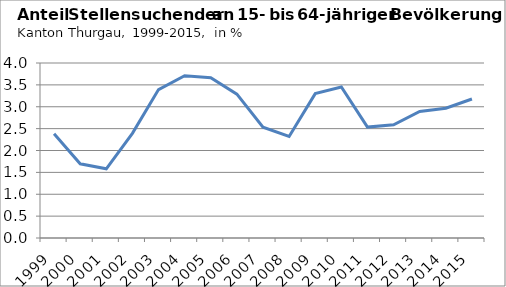
| Category | Anteil an 15- bis 64-jähriger Bevölkerung
in % |
|---|---|
| 1999.0 | 2.384 |
| 2000.0 | 1.696 |
| 2001.0 | 1.582 |
| 2002.0 | 2.392 |
| 2003.0 | 3.392 |
| 2004.0 | 3.709 |
| 2005.0 | 3.665 |
| 2006.0 | 3.288 |
| 2007.0 | 2.532 |
| 2008.0 | 2.321 |
| 2009.0 | 3.3 |
| 2010.0 | 3.453 |
| 2011.0 | 2.535 |
| 2012.0 | 2.589 |
| 2013.0 | 2.892 |
| 2014.0 | 2.966 |
| 2015.0 | 3.178 |